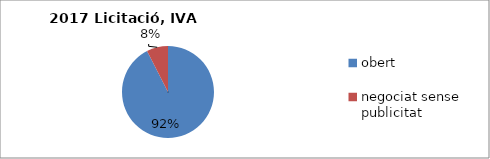
| Category | Licitació, IVA exclòs |
|---|---|
| obert | 13527008.58 |
| negociat sense publicitat  | 1101270.52 |